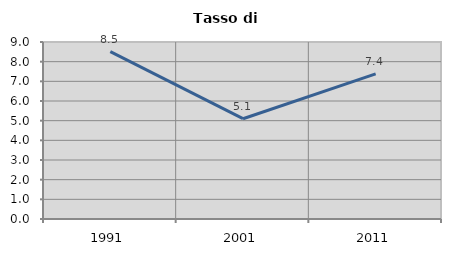
| Category | Tasso di disoccupazione   |
|---|---|
| 1991.0 | 8.513 |
| 2001.0 | 5.1 |
| 2011.0 | 7.377 |